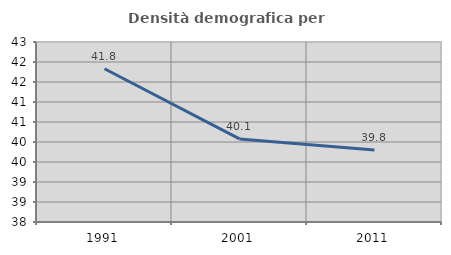
| Category | Densità demografica |
|---|---|
| 1991.0 | 41.83 |
| 2001.0 | 40.077 |
| 2011.0 | 39.799 |